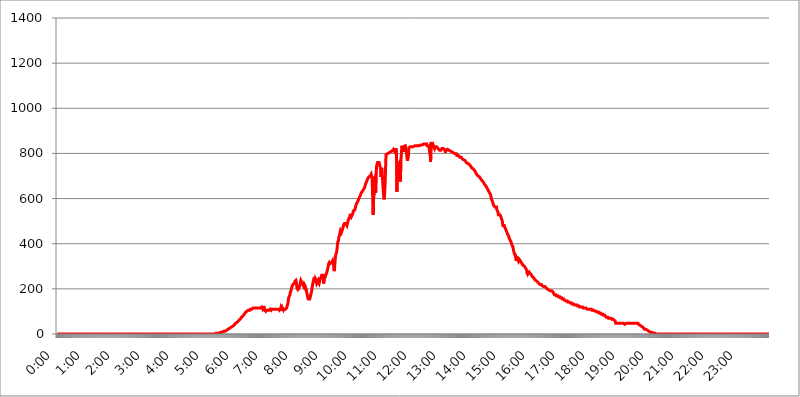
| Category | 2017.08.02. Intenzitás [W/m^2] |
|---|---|
| 0.0 | 0 |
| 0.0006944444444444445 | 0 |
| 0.001388888888888889 | 0 |
| 0.0020833333333333333 | 0 |
| 0.002777777777777778 | 0 |
| 0.003472222222222222 | 0 |
| 0.004166666666666667 | 0 |
| 0.004861111111111111 | 0 |
| 0.005555555555555556 | 0 |
| 0.0062499999999999995 | 0 |
| 0.006944444444444444 | 0 |
| 0.007638888888888889 | 0 |
| 0.008333333333333333 | 0 |
| 0.009027777777777779 | 0 |
| 0.009722222222222222 | 0 |
| 0.010416666666666666 | 0 |
| 0.011111111111111112 | 0 |
| 0.011805555555555555 | 0 |
| 0.012499999999999999 | 0 |
| 0.013194444444444444 | 0 |
| 0.013888888888888888 | 0 |
| 0.014583333333333332 | 0 |
| 0.015277777777777777 | 0 |
| 0.015972222222222224 | 0 |
| 0.016666666666666666 | 0 |
| 0.017361111111111112 | 0 |
| 0.018055555555555557 | 0 |
| 0.01875 | 0 |
| 0.019444444444444445 | 0 |
| 0.02013888888888889 | 0 |
| 0.020833333333333332 | 0 |
| 0.02152777777777778 | 0 |
| 0.022222222222222223 | 0 |
| 0.02291666666666667 | 0 |
| 0.02361111111111111 | 0 |
| 0.024305555555555556 | 0 |
| 0.024999999999999998 | 0 |
| 0.025694444444444447 | 0 |
| 0.02638888888888889 | 0 |
| 0.027083333333333334 | 0 |
| 0.027777777777777776 | 0 |
| 0.02847222222222222 | 0 |
| 0.029166666666666664 | 0 |
| 0.029861111111111113 | 0 |
| 0.030555555555555555 | 0 |
| 0.03125 | 0 |
| 0.03194444444444445 | 0 |
| 0.03263888888888889 | 0 |
| 0.03333333333333333 | 0 |
| 0.034027777777777775 | 0 |
| 0.034722222222222224 | 0 |
| 0.035416666666666666 | 0 |
| 0.036111111111111115 | 0 |
| 0.03680555555555556 | 0 |
| 0.0375 | 0 |
| 0.03819444444444444 | 0 |
| 0.03888888888888889 | 0 |
| 0.03958333333333333 | 0 |
| 0.04027777777777778 | 0 |
| 0.04097222222222222 | 0 |
| 0.041666666666666664 | 0 |
| 0.042361111111111106 | 0 |
| 0.04305555555555556 | 0 |
| 0.043750000000000004 | 0 |
| 0.044444444444444446 | 0 |
| 0.04513888888888889 | 0 |
| 0.04583333333333334 | 0 |
| 0.04652777777777778 | 0 |
| 0.04722222222222222 | 0 |
| 0.04791666666666666 | 0 |
| 0.04861111111111111 | 0 |
| 0.049305555555555554 | 0 |
| 0.049999999999999996 | 0 |
| 0.05069444444444445 | 0 |
| 0.051388888888888894 | 0 |
| 0.052083333333333336 | 0 |
| 0.05277777777777778 | 0 |
| 0.05347222222222222 | 0 |
| 0.05416666666666667 | 0 |
| 0.05486111111111111 | 0 |
| 0.05555555555555555 | 0 |
| 0.05625 | 0 |
| 0.05694444444444444 | 0 |
| 0.057638888888888885 | 0 |
| 0.05833333333333333 | 0 |
| 0.05902777777777778 | 0 |
| 0.059722222222222225 | 0 |
| 0.06041666666666667 | 0 |
| 0.061111111111111116 | 0 |
| 0.06180555555555556 | 0 |
| 0.0625 | 0 |
| 0.06319444444444444 | 0 |
| 0.06388888888888888 | 0 |
| 0.06458333333333334 | 0 |
| 0.06527777777777778 | 0 |
| 0.06597222222222222 | 0 |
| 0.06666666666666667 | 0 |
| 0.06736111111111111 | 0 |
| 0.06805555555555555 | 0 |
| 0.06874999999999999 | 0 |
| 0.06944444444444443 | 0 |
| 0.07013888888888889 | 0 |
| 0.07083333333333333 | 0 |
| 0.07152777777777779 | 0 |
| 0.07222222222222223 | 0 |
| 0.07291666666666667 | 0 |
| 0.07361111111111111 | 0 |
| 0.07430555555555556 | 0 |
| 0.075 | 0 |
| 0.07569444444444444 | 0 |
| 0.0763888888888889 | 0 |
| 0.07708333333333334 | 0 |
| 0.07777777777777778 | 0 |
| 0.07847222222222222 | 0 |
| 0.07916666666666666 | 0 |
| 0.0798611111111111 | 0 |
| 0.08055555555555556 | 0 |
| 0.08125 | 0 |
| 0.08194444444444444 | 0 |
| 0.08263888888888889 | 0 |
| 0.08333333333333333 | 0 |
| 0.08402777777777777 | 0 |
| 0.08472222222222221 | 0 |
| 0.08541666666666665 | 0 |
| 0.08611111111111112 | 0 |
| 0.08680555555555557 | 0 |
| 0.08750000000000001 | 0 |
| 0.08819444444444445 | 0 |
| 0.08888888888888889 | 0 |
| 0.08958333333333333 | 0 |
| 0.09027777777777778 | 0 |
| 0.09097222222222222 | 0 |
| 0.09166666666666667 | 0 |
| 0.09236111111111112 | 0 |
| 0.09305555555555556 | 0 |
| 0.09375 | 0 |
| 0.09444444444444444 | 0 |
| 0.09513888888888888 | 0 |
| 0.09583333333333333 | 0 |
| 0.09652777777777777 | 0 |
| 0.09722222222222222 | 0 |
| 0.09791666666666667 | 0 |
| 0.09861111111111111 | 0 |
| 0.09930555555555555 | 0 |
| 0.09999999999999999 | 0 |
| 0.10069444444444443 | 0 |
| 0.1013888888888889 | 0 |
| 0.10208333333333335 | 0 |
| 0.10277777777777779 | 0 |
| 0.10347222222222223 | 0 |
| 0.10416666666666667 | 0 |
| 0.10486111111111111 | 0 |
| 0.10555555555555556 | 0 |
| 0.10625 | 0 |
| 0.10694444444444444 | 0 |
| 0.1076388888888889 | 0 |
| 0.10833333333333334 | 0 |
| 0.10902777777777778 | 0 |
| 0.10972222222222222 | 0 |
| 0.1111111111111111 | 0 |
| 0.11180555555555556 | 0 |
| 0.11180555555555556 | 0 |
| 0.1125 | 0 |
| 0.11319444444444444 | 0 |
| 0.11388888888888889 | 0 |
| 0.11458333333333333 | 0 |
| 0.11527777777777777 | 0 |
| 0.11597222222222221 | 0 |
| 0.11666666666666665 | 0 |
| 0.1173611111111111 | 0 |
| 0.11805555555555557 | 0 |
| 0.11944444444444445 | 0 |
| 0.12013888888888889 | 0 |
| 0.12083333333333333 | 0 |
| 0.12152777777777778 | 0 |
| 0.12222222222222223 | 0 |
| 0.12291666666666667 | 0 |
| 0.12291666666666667 | 0 |
| 0.12361111111111112 | 0 |
| 0.12430555555555556 | 0 |
| 0.125 | 0 |
| 0.12569444444444444 | 0 |
| 0.12638888888888888 | 0 |
| 0.12708333333333333 | 0 |
| 0.16875 | 0 |
| 0.12847222222222224 | 0 |
| 0.12916666666666668 | 0 |
| 0.12986111111111112 | 0 |
| 0.13055555555555556 | 0 |
| 0.13125 | 0 |
| 0.13194444444444445 | 0 |
| 0.1326388888888889 | 0 |
| 0.13333333333333333 | 0 |
| 0.13402777777777777 | 0 |
| 0.13402777777777777 | 0 |
| 0.13472222222222222 | 0 |
| 0.13541666666666666 | 0 |
| 0.1361111111111111 | 0 |
| 0.13749999999999998 | 0 |
| 0.13819444444444443 | 0 |
| 0.1388888888888889 | 0 |
| 0.13958333333333334 | 0 |
| 0.14027777777777778 | 0 |
| 0.14097222222222222 | 0 |
| 0.14166666666666666 | 0 |
| 0.1423611111111111 | 0 |
| 0.14305555555555557 | 0 |
| 0.14375000000000002 | 0 |
| 0.14444444444444446 | 0 |
| 0.1451388888888889 | 0 |
| 0.1451388888888889 | 0 |
| 0.14652777777777778 | 0 |
| 0.14722222222222223 | 0 |
| 0.14791666666666667 | 0 |
| 0.1486111111111111 | 0 |
| 0.14930555555555555 | 0 |
| 0.15 | 0 |
| 0.15069444444444444 | 0 |
| 0.15138888888888888 | 0 |
| 0.15208333333333332 | 0 |
| 0.15277777777777776 | 0 |
| 0.15347222222222223 | 0 |
| 0.15416666666666667 | 0 |
| 0.15486111111111112 | 0 |
| 0.15555555555555556 | 0 |
| 0.15625 | 0 |
| 0.15694444444444444 | 0 |
| 0.15763888888888888 | 0 |
| 0.15833333333333333 | 0 |
| 0.15902777777777777 | 0 |
| 0.15972222222222224 | 0 |
| 0.16041666666666668 | 0 |
| 0.16111111111111112 | 0 |
| 0.16180555555555556 | 0 |
| 0.1625 | 0 |
| 0.16319444444444445 | 0 |
| 0.1638888888888889 | 0 |
| 0.16458333333333333 | 0 |
| 0.16527777777777777 | 0 |
| 0.16597222222222222 | 0 |
| 0.16666666666666666 | 0 |
| 0.1673611111111111 | 0 |
| 0.16805555555555554 | 0 |
| 0.16874999999999998 | 0 |
| 0.16944444444444443 | 0 |
| 0.17013888888888887 | 0 |
| 0.1708333333333333 | 0 |
| 0.17152777777777775 | 0 |
| 0.17222222222222225 | 0 |
| 0.1729166666666667 | 0 |
| 0.17361111111111113 | 0 |
| 0.17430555555555557 | 0 |
| 0.17500000000000002 | 0 |
| 0.17569444444444446 | 0 |
| 0.1763888888888889 | 0 |
| 0.17708333333333334 | 0 |
| 0.17777777777777778 | 0 |
| 0.17847222222222223 | 0 |
| 0.17916666666666667 | 0 |
| 0.1798611111111111 | 0 |
| 0.18055555555555555 | 0 |
| 0.18125 | 0 |
| 0.18194444444444444 | 0 |
| 0.1826388888888889 | 0 |
| 0.18333333333333335 | 0 |
| 0.1840277777777778 | 0 |
| 0.18472222222222223 | 0 |
| 0.18541666666666667 | 0 |
| 0.18611111111111112 | 0 |
| 0.18680555555555556 | 0 |
| 0.1875 | 0 |
| 0.18819444444444444 | 0 |
| 0.18888888888888888 | 0 |
| 0.18958333333333333 | 0 |
| 0.19027777777777777 | 0 |
| 0.1909722222222222 | 0 |
| 0.19166666666666665 | 0 |
| 0.19236111111111112 | 0 |
| 0.19305555555555554 | 0 |
| 0.19375 | 0 |
| 0.19444444444444445 | 0 |
| 0.1951388888888889 | 0 |
| 0.19583333333333333 | 0 |
| 0.19652777777777777 | 0 |
| 0.19722222222222222 | 0 |
| 0.19791666666666666 | 0 |
| 0.1986111111111111 | 0 |
| 0.19930555555555554 | 0 |
| 0.19999999999999998 | 0 |
| 0.20069444444444443 | 0 |
| 0.20138888888888887 | 0 |
| 0.2020833333333333 | 0 |
| 0.2027777777777778 | 0 |
| 0.2034722222222222 | 0 |
| 0.2041666666666667 | 0 |
| 0.20486111111111113 | 0 |
| 0.20555555555555557 | 0 |
| 0.20625000000000002 | 0 |
| 0.20694444444444446 | 0 |
| 0.2076388888888889 | 0 |
| 0.20833333333333334 | 0 |
| 0.20902777777777778 | 0 |
| 0.20972222222222223 | 0 |
| 0.21041666666666667 | 0 |
| 0.2111111111111111 | 0 |
| 0.21180555555555555 | 0 |
| 0.2125 | 0 |
| 0.21319444444444444 | 0 |
| 0.2138888888888889 | 0 |
| 0.21458333333333335 | 0 |
| 0.2152777777777778 | 0 |
| 0.21597222222222223 | 0 |
| 0.21666666666666667 | 0 |
| 0.21736111111111112 | 0 |
| 0.21805555555555556 | 0 |
| 0.21875 | 0 |
| 0.21944444444444444 | 0 |
| 0.22013888888888888 | 0 |
| 0.22083333333333333 | 0 |
| 0.22152777777777777 | 0 |
| 0.2222222222222222 | 0 |
| 0.22291666666666665 | 3.525 |
| 0.2236111111111111 | 3.525 |
| 0.22430555555555556 | 3.525 |
| 0.225 | 3.525 |
| 0.22569444444444445 | 3.525 |
| 0.2263888888888889 | 3.525 |
| 0.22708333333333333 | 3.525 |
| 0.22777777777777777 | 3.525 |
| 0.22847222222222222 | 3.525 |
| 0.22916666666666666 | 7.887 |
| 0.2298611111111111 | 7.887 |
| 0.23055555555555554 | 7.887 |
| 0.23124999999999998 | 7.887 |
| 0.23194444444444443 | 7.887 |
| 0.23263888888888887 | 12.257 |
| 0.2333333333333333 | 12.257 |
| 0.2340277777777778 | 12.257 |
| 0.2347222222222222 | 12.257 |
| 0.2354166666666667 | 12.257 |
| 0.23611111111111113 | 16.636 |
| 0.23680555555555557 | 16.636 |
| 0.23750000000000002 | 16.636 |
| 0.23819444444444446 | 21.024 |
| 0.2388888888888889 | 21.024 |
| 0.23958333333333334 | 21.024 |
| 0.24027777777777778 | 25.419 |
| 0.24097222222222223 | 25.419 |
| 0.24166666666666667 | 25.419 |
| 0.2423611111111111 | 29.823 |
| 0.24305555555555555 | 29.823 |
| 0.24375 | 29.823 |
| 0.24444444444444446 | 34.234 |
| 0.24513888888888888 | 34.234 |
| 0.24583333333333335 | 34.234 |
| 0.2465277777777778 | 38.653 |
| 0.24722222222222223 | 38.653 |
| 0.24791666666666667 | 38.653 |
| 0.24861111111111112 | 43.079 |
| 0.24930555555555556 | 43.079 |
| 0.25 | 47.511 |
| 0.25069444444444444 | 47.511 |
| 0.2513888888888889 | 47.511 |
| 0.2520833333333333 | 51.951 |
| 0.25277777777777777 | 51.951 |
| 0.2534722222222222 | 56.398 |
| 0.25416666666666665 | 56.398 |
| 0.2548611111111111 | 60.85 |
| 0.2555555555555556 | 60.85 |
| 0.25625000000000003 | 65.31 |
| 0.2569444444444445 | 65.31 |
| 0.2576388888888889 | 69.775 |
| 0.25833333333333336 | 74.246 |
| 0.2590277777777778 | 74.246 |
| 0.25972222222222224 | 78.722 |
| 0.2604166666666667 | 78.722 |
| 0.2611111111111111 | 83.205 |
| 0.26180555555555557 | 83.205 |
| 0.2625 | 87.692 |
| 0.26319444444444445 | 92.184 |
| 0.2638888888888889 | 92.184 |
| 0.26458333333333334 | 96.682 |
| 0.2652777777777778 | 96.682 |
| 0.2659722222222222 | 101.184 |
| 0.26666666666666666 | 101.184 |
| 0.2673611111111111 | 101.184 |
| 0.26805555555555555 | 105.69 |
| 0.26875 | 105.69 |
| 0.26944444444444443 | 105.69 |
| 0.2701388888888889 | 105.69 |
| 0.2708333333333333 | 110.201 |
| 0.27152777777777776 | 110.201 |
| 0.2722222222222222 | 110.201 |
| 0.27291666666666664 | 110.201 |
| 0.2736111111111111 | 110.201 |
| 0.2743055555555555 | 114.716 |
| 0.27499999999999997 | 114.716 |
| 0.27569444444444446 | 114.716 |
| 0.27638888888888885 | 114.716 |
| 0.27708333333333335 | 114.716 |
| 0.2777777777777778 | 114.716 |
| 0.27847222222222223 | 114.716 |
| 0.2791666666666667 | 114.716 |
| 0.2798611111111111 | 114.716 |
| 0.28055555555555556 | 114.716 |
| 0.28125 | 114.716 |
| 0.28194444444444444 | 114.716 |
| 0.2826388888888889 | 114.716 |
| 0.2833333333333333 | 114.716 |
| 0.28402777777777777 | 114.716 |
| 0.2847222222222222 | 114.716 |
| 0.28541666666666665 | 114.716 |
| 0.28611111111111115 | 114.716 |
| 0.28680555555555554 | 119.235 |
| 0.28750000000000003 | 114.716 |
| 0.2881944444444445 | 110.201 |
| 0.2888888888888889 | 114.716 |
| 0.28958333333333336 | 123.758 |
| 0.2902777777777778 | 123.758 |
| 0.29097222222222224 | 105.69 |
| 0.2916666666666667 | 105.69 |
| 0.2923611111111111 | 101.184 |
| 0.29305555555555557 | 105.69 |
| 0.29375 | 105.69 |
| 0.29444444444444445 | 105.69 |
| 0.2951388888888889 | 105.69 |
| 0.29583333333333334 | 105.69 |
| 0.2965277777777778 | 105.69 |
| 0.2972222222222222 | 105.69 |
| 0.29791666666666666 | 105.69 |
| 0.2986111111111111 | 110.201 |
| 0.29930555555555555 | 110.201 |
| 0.3 | 105.69 |
| 0.30069444444444443 | 110.201 |
| 0.3013888888888889 | 110.201 |
| 0.3020833333333333 | 110.201 |
| 0.30277777777777776 | 110.201 |
| 0.3034722222222222 | 110.201 |
| 0.30416666666666664 | 110.201 |
| 0.3048611111111111 | 110.201 |
| 0.3055555555555555 | 110.201 |
| 0.30624999999999997 | 110.201 |
| 0.3069444444444444 | 110.201 |
| 0.3076388888888889 | 110.201 |
| 0.30833333333333335 | 110.201 |
| 0.3090277777777778 | 110.201 |
| 0.30972222222222223 | 110.201 |
| 0.3104166666666667 | 110.201 |
| 0.3111111111111111 | 110.201 |
| 0.31180555555555556 | 105.69 |
| 0.3125 | 105.69 |
| 0.31319444444444444 | 110.201 |
| 0.3138888888888889 | 119.235 |
| 0.3145833333333333 | 114.716 |
| 0.31527777777777777 | 119.235 |
| 0.3159722222222222 | 119.235 |
| 0.31666666666666665 | 110.201 |
| 0.31736111111111115 | 105.69 |
| 0.31805555555555554 | 110.201 |
| 0.31875000000000003 | 110.201 |
| 0.3194444444444445 | 110.201 |
| 0.3201388888888889 | 110.201 |
| 0.32083333333333336 | 110.201 |
| 0.3215277777777778 | 114.716 |
| 0.32222222222222224 | 114.716 |
| 0.3229166666666667 | 128.284 |
| 0.3236111111111111 | 137.347 |
| 0.32430555555555557 | 155.509 |
| 0.325 | 164.605 |
| 0.32569444444444445 | 164.605 |
| 0.3263888888888889 | 173.709 |
| 0.32708333333333334 | 187.378 |
| 0.3277777777777778 | 191.937 |
| 0.3284722222222222 | 201.058 |
| 0.32916666666666666 | 210.182 |
| 0.3298611111111111 | 214.746 |
| 0.33055555555555555 | 219.309 |
| 0.33125 | 219.309 |
| 0.33194444444444443 | 223.873 |
| 0.3326388888888889 | 228.436 |
| 0.3333333333333333 | 233 |
| 0.3340277777777778 | 233 |
| 0.3347222222222222 | 237.564 |
| 0.3354166666666667 | 228.436 |
| 0.3361111111111111 | 205.62 |
| 0.3368055555555556 | 201.058 |
| 0.33749999999999997 | 196.497 |
| 0.33819444444444446 | 196.497 |
| 0.33888888888888885 | 201.058 |
| 0.33958333333333335 | 210.182 |
| 0.34027777777777773 | 214.746 |
| 0.34097222222222223 | 228.436 |
| 0.3416666666666666 | 237.564 |
| 0.3423611111111111 | 233 |
| 0.3430555555555555 | 228.436 |
| 0.34375 | 228.436 |
| 0.3444444444444445 | 223.873 |
| 0.3451388888888889 | 214.746 |
| 0.3458333333333334 | 210.182 |
| 0.34652777777777777 | 219.309 |
| 0.34722222222222227 | 214.746 |
| 0.34791666666666665 | 210.182 |
| 0.34861111111111115 | 201.058 |
| 0.34930555555555554 | 196.497 |
| 0.35000000000000003 | 182.82 |
| 0.3506944444444444 | 173.709 |
| 0.3513888888888889 | 160.056 |
| 0.3520833333333333 | 155.509 |
| 0.3527777777777778 | 155.509 |
| 0.3534722222222222 | 155.509 |
| 0.3541666666666667 | 155.509 |
| 0.3548611111111111 | 164.605 |
| 0.35555555555555557 | 173.709 |
| 0.35625 | 182.82 |
| 0.35694444444444445 | 191.937 |
| 0.3576388888888889 | 210.182 |
| 0.35833333333333334 | 219.309 |
| 0.3590277777777778 | 233 |
| 0.3597222222222222 | 242.127 |
| 0.36041666666666666 | 242.127 |
| 0.3611111111111111 | 237.564 |
| 0.36180555555555555 | 246.689 |
| 0.3625 | 242.127 |
| 0.36319444444444443 | 233 |
| 0.3638888888888889 | 223.873 |
| 0.3645833333333333 | 223.873 |
| 0.3652777777777778 | 233 |
| 0.3659722222222222 | 237.564 |
| 0.3666666666666667 | 228.436 |
| 0.3673611111111111 | 223.873 |
| 0.3680555555555556 | 223.873 |
| 0.36874999999999997 | 242.127 |
| 0.36944444444444446 | 246.689 |
| 0.37013888888888885 | 251.251 |
| 0.37083333333333335 | 260.373 |
| 0.37152777777777773 | 260.373 |
| 0.37222222222222223 | 260.373 |
| 0.3729166666666666 | 260.373 |
| 0.3736111111111111 | 223.873 |
| 0.3743055555555555 | 242.127 |
| 0.375 | 242.127 |
| 0.3756944444444445 | 251.251 |
| 0.3763888888888889 | 260.373 |
| 0.3770833333333334 | 260.373 |
| 0.37777777777777777 | 269.49 |
| 0.37847222222222227 | 269.49 |
| 0.37916666666666665 | 269.49 |
| 0.37986111111111115 | 296.808 |
| 0.38055555555555554 | 310.44 |
| 0.38125000000000003 | 314.98 |
| 0.3819444444444444 | 310.44 |
| 0.3826388888888889 | 310.44 |
| 0.3833333333333333 | 314.98 |
| 0.3840277777777778 | 314.98 |
| 0.3847222222222222 | 314.98 |
| 0.3854166666666667 | 319.517 |
| 0.3861111111111111 | 324.052 |
| 0.38680555555555557 | 310.44 |
| 0.3875 | 305.898 |
| 0.38819444444444445 | 278.603 |
| 0.3888888888888889 | 287.709 |
| 0.38958333333333334 | 319.517 |
| 0.3902777777777778 | 346.682 |
| 0.3909722222222222 | 346.682 |
| 0.39166666666666666 | 360.221 |
| 0.3923611111111111 | 373.729 |
| 0.39305555555555555 | 400.638 |
| 0.39375 | 409.574 |
| 0.39444444444444443 | 414.035 |
| 0.3951388888888889 | 431.833 |
| 0.3958333333333333 | 436.27 |
| 0.3965277777777778 | 449.551 |
| 0.3972222222222222 | 458.38 |
| 0.3979166666666667 | 462.786 |
| 0.3986111111111111 | 449.551 |
| 0.3993055555555556 | 453.968 |
| 0.39999999999999997 | 462.786 |
| 0.40069444444444446 | 471.582 |
| 0.40138888888888885 | 480.356 |
| 0.40208333333333335 | 480.356 |
| 0.40277777777777773 | 489.108 |
| 0.40347222222222223 | 493.475 |
| 0.4041666666666666 | 493.475 |
| 0.4048611111111111 | 489.108 |
| 0.4055555555555555 | 484.735 |
| 0.40625 | 480.356 |
| 0.4069444444444445 | 489.108 |
| 0.4076388888888889 | 497.836 |
| 0.4083333333333334 | 506.542 |
| 0.40902777777777777 | 510.885 |
| 0.40972222222222227 | 510.885 |
| 0.41041666666666665 | 519.555 |
| 0.41111111111111115 | 532.513 |
| 0.41180555555555554 | 528.2 |
| 0.41250000000000003 | 519.555 |
| 0.4131944444444444 | 519.555 |
| 0.4138888888888889 | 523.88 |
| 0.4145833333333333 | 532.513 |
| 0.4152777777777778 | 545.416 |
| 0.4159722222222222 | 545.416 |
| 0.4166666666666667 | 545.416 |
| 0.4173611111111111 | 549.704 |
| 0.41805555555555557 | 558.261 |
| 0.41875 | 562.53 |
| 0.41944444444444445 | 575.299 |
| 0.4201388888888889 | 579.542 |
| 0.42083333333333334 | 583.779 |
| 0.4215277777777778 | 588.009 |
| 0.4222222222222222 | 592.233 |
| 0.42291666666666666 | 596.45 |
| 0.4236111111111111 | 604.864 |
| 0.42430555555555555 | 609.062 |
| 0.425 | 613.252 |
| 0.42569444444444443 | 617.436 |
| 0.4263888888888889 | 625.784 |
| 0.4270833333333333 | 629.948 |
| 0.4277777777777778 | 625.784 |
| 0.4284722222222222 | 634.105 |
| 0.4291666666666667 | 638.256 |
| 0.4298611111111111 | 642.4 |
| 0.4305555555555556 | 646.537 |
| 0.43124999999999997 | 650.667 |
| 0.43194444444444446 | 658.909 |
| 0.43263888888888885 | 667.123 |
| 0.43333333333333335 | 671.22 |
| 0.43402777777777773 | 675.311 |
| 0.43472222222222223 | 683.473 |
| 0.4354166666666666 | 687.544 |
| 0.4361111111111111 | 687.544 |
| 0.4368055555555555 | 695.666 |
| 0.4375 | 695.666 |
| 0.4381944444444445 | 695.666 |
| 0.4388888888888889 | 699.717 |
| 0.4395833333333334 | 699.717 |
| 0.44027777777777777 | 707.8 |
| 0.44097222222222227 | 707.8 |
| 0.44166666666666665 | 687.544 |
| 0.44236111111111115 | 683.473 |
| 0.44305555555555554 | 528.2 |
| 0.44375000000000003 | 604.864 |
| 0.4444444444444444 | 617.436 |
| 0.4451388888888889 | 687.544 |
| 0.4458333333333333 | 699.717 |
| 0.4465277777777778 | 625.784 |
| 0.4472222222222222 | 707.8 |
| 0.4479166666666667 | 743.859 |
| 0.4486111111111111 | 751.803 |
| 0.44930555555555557 | 759.723 |
| 0.45 | 759.723 |
| 0.45069444444444445 | 763.674 |
| 0.4513888888888889 | 759.723 |
| 0.45208333333333334 | 759.723 |
| 0.4527777777777778 | 759.723 |
| 0.4534722222222222 | 731.896 |
| 0.45416666666666666 | 695.666 |
| 0.4548611111111111 | 735.89 |
| 0.45555555555555555 | 727.896 |
| 0.45625 | 723.889 |
| 0.45694444444444443 | 646.537 |
| 0.4576388888888889 | 642.4 |
| 0.4583333333333333 | 596.45 |
| 0.4590277777777778 | 613.252 |
| 0.4597222222222222 | 654.791 |
| 0.4604166666666667 | 727.896 |
| 0.4611111111111111 | 795.074 |
| 0.4618055555555556 | 798.974 |
| 0.46249999999999997 | 798.974 |
| 0.46319444444444446 | 798.974 |
| 0.46388888888888885 | 798.974 |
| 0.46458333333333335 | 798.974 |
| 0.46527777777777773 | 802.868 |
| 0.46597222222222223 | 802.868 |
| 0.4666666666666666 | 802.868 |
| 0.4673611111111111 | 806.757 |
| 0.4680555555555555 | 806.757 |
| 0.46875 | 806.757 |
| 0.4694444444444445 | 810.641 |
| 0.4701388888888889 | 814.519 |
| 0.4708333333333334 | 814.519 |
| 0.47152777777777777 | 818.392 |
| 0.47222222222222227 | 818.392 |
| 0.47291666666666665 | 818.392 |
| 0.47361111111111115 | 806.757 |
| 0.47430555555555554 | 806.757 |
| 0.47500000000000003 | 822.26 |
| 0.4756944444444444 | 806.757 |
| 0.4763888888888889 | 629.948 |
| 0.4770833333333333 | 743.859 |
| 0.4777777777777778 | 739.877 |
| 0.4784722222222222 | 747.834 |
| 0.4791666666666667 | 755.766 |
| 0.4798611111111111 | 739.877 |
| 0.48055555555555557 | 695.666 |
| 0.48125 | 675.311 |
| 0.48194444444444445 | 763.674 |
| 0.4826388888888889 | 798.974 |
| 0.48333333333333334 | 833.834 |
| 0.4840277777777778 | 829.981 |
| 0.4847222222222222 | 818.392 |
| 0.48541666666666666 | 806.757 |
| 0.4861111111111111 | 829.981 |
| 0.48680555555555555 | 833.834 |
| 0.4875 | 833.834 |
| 0.48819444444444443 | 833.834 |
| 0.4888888888888889 | 826.123 |
| 0.4895833333333333 | 806.757 |
| 0.4902777777777778 | 791.169 |
| 0.4909722222222222 | 767.62 |
| 0.4916666666666667 | 775.492 |
| 0.4923611111111111 | 783.342 |
| 0.4930555555555556 | 822.26 |
| 0.49374999999999997 | 822.26 |
| 0.49444444444444446 | 822.26 |
| 0.49513888888888885 | 829.981 |
| 0.49583333333333335 | 829.981 |
| 0.49652777777777773 | 829.981 |
| 0.49722222222222223 | 829.981 |
| 0.4979166666666666 | 833.834 |
| 0.4986111111111111 | 829.981 |
| 0.4993055555555555 | 829.981 |
| 0.5 | 833.834 |
| 0.5006944444444444 | 833.834 |
| 0.5013888888888889 | 833.834 |
| 0.5020833333333333 | 833.834 |
| 0.5027777777777778 | 829.981 |
| 0.5034722222222222 | 833.834 |
| 0.5041666666666667 | 833.834 |
| 0.5048611111111111 | 833.834 |
| 0.5055555555555555 | 833.834 |
| 0.50625 | 833.834 |
| 0.5069444444444444 | 837.682 |
| 0.5076388888888889 | 833.834 |
| 0.5083333333333333 | 833.834 |
| 0.5090277777777777 | 837.682 |
| 0.5097222222222222 | 837.682 |
| 0.5104166666666666 | 837.682 |
| 0.5111111111111112 | 837.682 |
| 0.5118055555555555 | 837.682 |
| 0.5125000000000001 | 837.682 |
| 0.5131944444444444 | 837.682 |
| 0.513888888888889 | 841.526 |
| 0.5145833333333333 | 841.526 |
| 0.5152777777777778 | 841.526 |
| 0.5159722222222222 | 841.526 |
| 0.5166666666666667 | 841.526 |
| 0.517361111111111 | 841.526 |
| 0.5180555555555556 | 841.526 |
| 0.5187499999999999 | 833.834 |
| 0.5194444444444445 | 837.682 |
| 0.5201388888888888 | 829.981 |
| 0.5208333333333334 | 833.834 |
| 0.5215277777777778 | 826.123 |
| 0.5222222222222223 | 802.868 |
| 0.5229166666666667 | 818.392 |
| 0.5236111111111111 | 763.674 |
| 0.5243055555555556 | 845.365 |
| 0.525 | 845.365 |
| 0.5256944444444445 | 841.526 |
| 0.5263888888888889 | 845.365 |
| 0.5270833333333333 | 837.682 |
| 0.5277777777777778 | 841.526 |
| 0.5284722222222222 | 837.682 |
| 0.5291666666666667 | 822.26 |
| 0.5298611111111111 | 829.981 |
| 0.5305555555555556 | 829.981 |
| 0.53125 | 829.981 |
| 0.5319444444444444 | 829.981 |
| 0.5326388888888889 | 829.981 |
| 0.5333333333333333 | 826.123 |
| 0.5340277777777778 | 822.26 |
| 0.5347222222222222 | 822.26 |
| 0.5354166666666667 | 818.392 |
| 0.5361111111111111 | 814.519 |
| 0.5368055555555555 | 818.392 |
| 0.5375 | 814.519 |
| 0.5381944444444444 | 814.519 |
| 0.5388888888888889 | 818.392 |
| 0.5395833333333333 | 822.26 |
| 0.5402777777777777 | 818.392 |
| 0.5409722222222222 | 818.392 |
| 0.5416666666666666 | 822.26 |
| 0.5423611111111112 | 822.26 |
| 0.5430555555555555 | 818.392 |
| 0.5437500000000001 | 814.519 |
| 0.5444444444444444 | 802.868 |
| 0.545138888888889 | 814.519 |
| 0.5458333333333333 | 818.392 |
| 0.5465277777777778 | 814.519 |
| 0.5472222222222222 | 818.392 |
| 0.5479166666666667 | 814.519 |
| 0.548611111111111 | 814.519 |
| 0.5493055555555556 | 814.519 |
| 0.5499999999999999 | 814.519 |
| 0.5506944444444445 | 810.641 |
| 0.5513888888888888 | 810.641 |
| 0.5520833333333334 | 810.641 |
| 0.5527777777777778 | 806.757 |
| 0.5534722222222223 | 806.757 |
| 0.5541666666666667 | 806.757 |
| 0.5548611111111111 | 802.868 |
| 0.5555555555555556 | 802.868 |
| 0.55625 | 798.974 |
| 0.5569444444444445 | 802.868 |
| 0.5576388888888889 | 798.974 |
| 0.5583333333333333 | 798.974 |
| 0.5590277777777778 | 798.974 |
| 0.5597222222222222 | 798.974 |
| 0.5604166666666667 | 791.169 |
| 0.5611111111111111 | 791.169 |
| 0.5618055555555556 | 791.169 |
| 0.5625 | 791.169 |
| 0.5631944444444444 | 787.258 |
| 0.5638888888888889 | 787.258 |
| 0.5645833333333333 | 783.342 |
| 0.5652777777777778 | 783.342 |
| 0.5659722222222222 | 783.342 |
| 0.5666666666666667 | 783.342 |
| 0.5673611111111111 | 779.42 |
| 0.5680555555555555 | 775.492 |
| 0.56875 | 775.492 |
| 0.5694444444444444 | 771.559 |
| 0.5701388888888889 | 771.559 |
| 0.5708333333333333 | 767.62 |
| 0.5715277777777777 | 767.62 |
| 0.5722222222222222 | 767.62 |
| 0.5729166666666666 | 763.674 |
| 0.5736111111111112 | 759.723 |
| 0.5743055555555555 | 763.674 |
| 0.5750000000000001 | 759.723 |
| 0.5756944444444444 | 755.766 |
| 0.576388888888889 | 751.803 |
| 0.5770833333333333 | 751.803 |
| 0.5777777777777778 | 751.803 |
| 0.5784722222222222 | 747.834 |
| 0.5791666666666667 | 747.834 |
| 0.579861111111111 | 743.859 |
| 0.5805555555555556 | 739.877 |
| 0.5812499999999999 | 735.89 |
| 0.5819444444444445 | 735.89 |
| 0.5826388888888888 | 735.89 |
| 0.5833333333333334 | 731.896 |
| 0.5840277777777778 | 727.896 |
| 0.5847222222222223 | 727.896 |
| 0.5854166666666667 | 723.889 |
| 0.5861111111111111 | 719.877 |
| 0.5868055555555556 | 715.858 |
| 0.5875 | 715.858 |
| 0.5881944444444445 | 707.8 |
| 0.5888888888888889 | 707.8 |
| 0.5895833333333333 | 703.762 |
| 0.5902777777777778 | 699.717 |
| 0.5909722222222222 | 699.717 |
| 0.5916666666666667 | 695.666 |
| 0.5923611111111111 | 695.666 |
| 0.5930555555555556 | 691.608 |
| 0.59375 | 687.544 |
| 0.5944444444444444 | 683.473 |
| 0.5951388888888889 | 683.473 |
| 0.5958333333333333 | 679.395 |
| 0.5965277777777778 | 679.395 |
| 0.5972222222222222 | 675.311 |
| 0.5979166666666667 | 671.22 |
| 0.5986111111111111 | 667.123 |
| 0.5993055555555555 | 663.019 |
| 0.6 | 658.909 |
| 0.6006944444444444 | 658.909 |
| 0.6013888888888889 | 654.791 |
| 0.6020833333333333 | 650.667 |
| 0.6027777777777777 | 646.537 |
| 0.6034722222222222 | 642.4 |
| 0.6041666666666666 | 638.256 |
| 0.6048611111111112 | 638.256 |
| 0.6055555555555555 | 634.105 |
| 0.6062500000000001 | 625.784 |
| 0.6069444444444444 | 625.784 |
| 0.607638888888889 | 617.436 |
| 0.6083333333333333 | 609.062 |
| 0.6090277777777778 | 596.45 |
| 0.6097222222222222 | 592.233 |
| 0.6104166666666667 | 588.009 |
| 0.611111111111111 | 579.542 |
| 0.6118055555555556 | 571.049 |
| 0.6124999999999999 | 571.049 |
| 0.6131944444444445 | 566.793 |
| 0.6138888888888888 | 562.53 |
| 0.6145833333333334 | 562.53 |
| 0.6152777777777778 | 562.53 |
| 0.6159722222222223 | 562.53 |
| 0.6166666666666667 | 549.704 |
| 0.6173611111111111 | 549.704 |
| 0.6180555555555556 | 541.121 |
| 0.61875 | 528.2 |
| 0.6194444444444445 | 532.513 |
| 0.6201388888888889 | 532.513 |
| 0.6208333333333333 | 528.2 |
| 0.6215277777777778 | 523.88 |
| 0.6222222222222222 | 519.555 |
| 0.6229166666666667 | 515.223 |
| 0.6236111111111111 | 506.542 |
| 0.6243055555555556 | 497.836 |
| 0.625 | 480.356 |
| 0.6256944444444444 | 480.356 |
| 0.6263888888888889 | 480.356 |
| 0.6270833333333333 | 480.356 |
| 0.6277777777777778 | 471.582 |
| 0.6284722222222222 | 467.187 |
| 0.6291666666666667 | 462.786 |
| 0.6298611111111111 | 462.786 |
| 0.6305555555555555 | 458.38 |
| 0.63125 | 445.129 |
| 0.6319444444444444 | 440.702 |
| 0.6326388888888889 | 436.27 |
| 0.6333333333333333 | 431.833 |
| 0.6340277777777777 | 422.943 |
| 0.6347222222222222 | 422.943 |
| 0.6354166666666666 | 414.035 |
| 0.6361111111111112 | 409.574 |
| 0.6368055555555555 | 405.108 |
| 0.6375000000000001 | 396.164 |
| 0.6381944444444444 | 391.685 |
| 0.638888888888889 | 387.202 |
| 0.6395833333333333 | 378.224 |
| 0.6402777777777778 | 364.728 |
| 0.6409722222222222 | 364.728 |
| 0.6416666666666667 | 351.198 |
| 0.642361111111111 | 346.682 |
| 0.6430555555555556 | 337.639 |
| 0.6437499999999999 | 324.052 |
| 0.6444444444444445 | 337.639 |
| 0.6451388888888888 | 337.639 |
| 0.6458333333333334 | 328.584 |
| 0.6465277777777778 | 324.052 |
| 0.6472222222222223 | 333.113 |
| 0.6479166666666667 | 333.113 |
| 0.6486111111111111 | 328.584 |
| 0.6493055555555556 | 324.052 |
| 0.65 | 319.517 |
| 0.6506944444444445 | 319.517 |
| 0.6513888888888889 | 314.98 |
| 0.6520833333333333 | 310.44 |
| 0.6527777777777778 | 305.898 |
| 0.6534722222222222 | 305.898 |
| 0.6541666666666667 | 305.898 |
| 0.6548611111111111 | 301.354 |
| 0.6555555555555556 | 296.808 |
| 0.65625 | 296.808 |
| 0.6569444444444444 | 292.259 |
| 0.6576388888888889 | 287.709 |
| 0.6583333333333333 | 283.156 |
| 0.6590277777777778 | 269.49 |
| 0.6597222222222222 | 264.932 |
| 0.6604166666666667 | 269.49 |
| 0.6611111111111111 | 269.49 |
| 0.6618055555555555 | 274.047 |
| 0.6625 | 269.49 |
| 0.6631944444444444 | 269.49 |
| 0.6638888888888889 | 269.49 |
| 0.6645833333333333 | 264.932 |
| 0.6652777777777777 | 260.373 |
| 0.6659722222222222 | 255.813 |
| 0.6666666666666666 | 255.813 |
| 0.6673611111111111 | 251.251 |
| 0.6680555555555556 | 251.251 |
| 0.6687500000000001 | 246.689 |
| 0.6694444444444444 | 242.127 |
| 0.6701388888888888 | 242.127 |
| 0.6708333333333334 | 237.564 |
| 0.6715277777777778 | 237.564 |
| 0.6722222222222222 | 237.564 |
| 0.6729166666666666 | 233 |
| 0.6736111111111112 | 233 |
| 0.6743055555555556 | 228.436 |
| 0.6749999999999999 | 228.436 |
| 0.6756944444444444 | 223.873 |
| 0.6763888888888889 | 223.873 |
| 0.6770833333333334 | 219.309 |
| 0.6777777777777777 | 219.309 |
| 0.6784722222222223 | 219.309 |
| 0.6791666666666667 | 219.309 |
| 0.6798611111111111 | 214.746 |
| 0.6805555555555555 | 214.746 |
| 0.68125 | 214.746 |
| 0.6819444444444445 | 210.182 |
| 0.6826388888888889 | 210.182 |
| 0.6833333333333332 | 210.182 |
| 0.6840277777777778 | 210.182 |
| 0.6847222222222222 | 210.182 |
| 0.6854166666666667 | 205.62 |
| 0.686111111111111 | 205.62 |
| 0.6868055555555556 | 201.058 |
| 0.6875 | 201.058 |
| 0.6881944444444444 | 201.058 |
| 0.688888888888889 | 196.497 |
| 0.6895833333333333 | 196.497 |
| 0.6902777777777778 | 196.497 |
| 0.6909722222222222 | 191.937 |
| 0.6916666666666668 | 191.937 |
| 0.6923611111111111 | 191.937 |
| 0.6930555555555555 | 191.937 |
| 0.69375 | 191.937 |
| 0.6944444444444445 | 191.937 |
| 0.6951388888888889 | 187.378 |
| 0.6958333333333333 | 182.82 |
| 0.6965277777777777 | 178.264 |
| 0.6972222222222223 | 173.709 |
| 0.6979166666666666 | 173.709 |
| 0.6986111111111111 | 173.709 |
| 0.6993055555555556 | 173.709 |
| 0.7000000000000001 | 169.156 |
| 0.7006944444444444 | 169.156 |
| 0.7013888888888888 | 169.156 |
| 0.7020833333333334 | 169.156 |
| 0.7027777777777778 | 164.605 |
| 0.7034722222222222 | 164.605 |
| 0.7041666666666666 | 164.605 |
| 0.7048611111111112 | 164.605 |
| 0.7055555555555556 | 160.056 |
| 0.7062499999999999 | 160.056 |
| 0.7069444444444444 | 160.056 |
| 0.7076388888888889 | 160.056 |
| 0.7083333333333334 | 155.509 |
| 0.7090277777777777 | 155.509 |
| 0.7097222222222223 | 155.509 |
| 0.7104166666666667 | 155.509 |
| 0.7111111111111111 | 150.964 |
| 0.7118055555555555 | 150.964 |
| 0.7125 | 150.964 |
| 0.7131944444444445 | 146.423 |
| 0.7138888888888889 | 146.423 |
| 0.7145833333333332 | 146.423 |
| 0.7152777777777778 | 146.423 |
| 0.7159722222222222 | 141.884 |
| 0.7166666666666667 | 141.884 |
| 0.717361111111111 | 141.884 |
| 0.7180555555555556 | 141.884 |
| 0.71875 | 141.884 |
| 0.7194444444444444 | 137.347 |
| 0.720138888888889 | 137.347 |
| 0.7208333333333333 | 137.347 |
| 0.7215277777777778 | 137.347 |
| 0.7222222222222222 | 132.814 |
| 0.7229166666666668 | 132.814 |
| 0.7236111111111111 | 132.814 |
| 0.7243055555555555 | 132.814 |
| 0.725 | 128.284 |
| 0.7256944444444445 | 128.284 |
| 0.7263888888888889 | 128.284 |
| 0.7270833333333333 | 128.284 |
| 0.7277777777777777 | 128.284 |
| 0.7284722222222223 | 128.284 |
| 0.7291666666666666 | 128.284 |
| 0.7298611111111111 | 123.758 |
| 0.7305555555555556 | 123.758 |
| 0.7312500000000001 | 123.758 |
| 0.7319444444444444 | 123.758 |
| 0.7326388888888888 | 119.235 |
| 0.7333333333333334 | 119.235 |
| 0.7340277777777778 | 119.235 |
| 0.7347222222222222 | 119.235 |
| 0.7354166666666666 | 119.235 |
| 0.7361111111111112 | 119.235 |
| 0.7368055555555556 | 119.235 |
| 0.7374999999999999 | 114.716 |
| 0.7381944444444444 | 114.716 |
| 0.7388888888888889 | 114.716 |
| 0.7395833333333334 | 114.716 |
| 0.7402777777777777 | 114.716 |
| 0.7409722222222223 | 114.716 |
| 0.7416666666666667 | 114.716 |
| 0.7423611111111111 | 114.716 |
| 0.7430555555555555 | 110.201 |
| 0.74375 | 110.201 |
| 0.7444444444444445 | 110.201 |
| 0.7451388888888889 | 110.201 |
| 0.7458333333333332 | 110.201 |
| 0.7465277777777778 | 110.201 |
| 0.7472222222222222 | 110.201 |
| 0.7479166666666667 | 110.201 |
| 0.748611111111111 | 110.201 |
| 0.7493055555555556 | 110.201 |
| 0.75 | 105.69 |
| 0.7506944444444444 | 105.69 |
| 0.751388888888889 | 105.69 |
| 0.7520833333333333 | 105.69 |
| 0.7527777777777778 | 105.69 |
| 0.7534722222222222 | 105.69 |
| 0.7541666666666668 | 101.184 |
| 0.7548611111111111 | 101.184 |
| 0.7555555555555555 | 101.184 |
| 0.75625 | 101.184 |
| 0.7569444444444445 | 101.184 |
| 0.7576388888888889 | 96.682 |
| 0.7583333333333333 | 96.682 |
| 0.7590277777777777 | 96.682 |
| 0.7597222222222223 | 96.682 |
| 0.7604166666666666 | 92.184 |
| 0.7611111111111111 | 92.184 |
| 0.7618055555555556 | 92.184 |
| 0.7625000000000001 | 92.184 |
| 0.7631944444444444 | 87.692 |
| 0.7638888888888888 | 87.692 |
| 0.7645833333333334 | 87.692 |
| 0.7652777777777778 | 87.692 |
| 0.7659722222222222 | 83.205 |
| 0.7666666666666666 | 83.205 |
| 0.7673611111111112 | 83.205 |
| 0.7680555555555556 | 83.205 |
| 0.7687499999999999 | 78.722 |
| 0.7694444444444444 | 78.722 |
| 0.7701388888888889 | 74.246 |
| 0.7708333333333334 | 74.246 |
| 0.7715277777777777 | 74.246 |
| 0.7722222222222223 | 74.246 |
| 0.7729166666666667 | 69.775 |
| 0.7736111111111111 | 69.775 |
| 0.7743055555555555 | 69.775 |
| 0.775 | 69.775 |
| 0.7756944444444445 | 69.775 |
| 0.7763888888888889 | 69.775 |
| 0.7770833333333332 | 69.775 |
| 0.7777777777777778 | 65.31 |
| 0.7784722222222222 | 65.31 |
| 0.7791666666666667 | 65.31 |
| 0.779861111111111 | 65.31 |
| 0.7805555555555556 | 65.31 |
| 0.78125 | 60.85 |
| 0.7819444444444444 | 60.85 |
| 0.782638888888889 | 56.398 |
| 0.7833333333333333 | 47.511 |
| 0.7840277777777778 | 47.511 |
| 0.7847222222222222 | 47.511 |
| 0.7854166666666668 | 47.511 |
| 0.7861111111111111 | 47.511 |
| 0.7868055555555555 | 47.511 |
| 0.7875 | 47.511 |
| 0.7881944444444445 | 47.511 |
| 0.7888888888888889 | 47.511 |
| 0.7895833333333333 | 47.511 |
| 0.7902777777777777 | 47.511 |
| 0.7909722222222223 | 47.511 |
| 0.7916666666666666 | 47.511 |
| 0.7923611111111111 | 47.511 |
| 0.7930555555555556 | 47.511 |
| 0.7937500000000001 | 47.511 |
| 0.7944444444444444 | 47.511 |
| 0.7951388888888888 | 47.511 |
| 0.7958333333333334 | 43.079 |
| 0.7965277777777778 | 43.079 |
| 0.7972222222222222 | 43.079 |
| 0.7979166666666666 | 47.511 |
| 0.7986111111111112 | 47.511 |
| 0.7993055555555556 | 47.511 |
| 0.7999999999999999 | 47.511 |
| 0.8006944444444444 | 47.511 |
| 0.8013888888888889 | 47.511 |
| 0.8020833333333334 | 47.511 |
| 0.8027777777777777 | 47.511 |
| 0.8034722222222223 | 47.511 |
| 0.8041666666666667 | 47.511 |
| 0.8048611111111111 | 47.511 |
| 0.8055555555555555 | 47.511 |
| 0.80625 | 47.511 |
| 0.8069444444444445 | 47.511 |
| 0.8076388888888889 | 47.511 |
| 0.8083333333333332 | 47.511 |
| 0.8090277777777778 | 47.511 |
| 0.8097222222222222 | 47.511 |
| 0.8104166666666667 | 47.511 |
| 0.811111111111111 | 47.511 |
| 0.8118055555555556 | 47.511 |
| 0.8125 | 47.511 |
| 0.8131944444444444 | 47.511 |
| 0.813888888888889 | 47.511 |
| 0.8145833333333333 | 47.511 |
| 0.8152777777777778 | 43.079 |
| 0.8159722222222222 | 43.079 |
| 0.8166666666666668 | 38.653 |
| 0.8173611111111111 | 38.653 |
| 0.8180555555555555 | 38.653 |
| 0.81875 | 38.653 |
| 0.8194444444444445 | 34.234 |
| 0.8201388888888889 | 34.234 |
| 0.8208333333333333 | 29.823 |
| 0.8215277777777777 | 29.823 |
| 0.8222222222222223 | 25.419 |
| 0.8229166666666666 | 25.419 |
| 0.8236111111111111 | 21.024 |
| 0.8243055555555556 | 21.024 |
| 0.8250000000000001 | 21.024 |
| 0.8256944444444444 | 21.024 |
| 0.8263888888888888 | 16.636 |
| 0.8270833333333334 | 16.636 |
| 0.8277777777777778 | 16.636 |
| 0.8284722222222222 | 12.257 |
| 0.8291666666666666 | 12.257 |
| 0.8298611111111112 | 12.257 |
| 0.8305555555555556 | 12.257 |
| 0.8312499999999999 | 12.257 |
| 0.8319444444444444 | 7.887 |
| 0.8326388888888889 | 7.887 |
| 0.8333333333333334 | 7.887 |
| 0.8340277777777777 | 7.887 |
| 0.8347222222222223 | 7.887 |
| 0.8354166666666667 | 3.525 |
| 0.8361111111111111 | 3.525 |
| 0.8368055555555555 | 3.525 |
| 0.8375 | 3.525 |
| 0.8381944444444445 | 3.525 |
| 0.8388888888888889 | 3.525 |
| 0.8395833333333332 | 0 |
| 0.8402777777777778 | 0 |
| 0.8409722222222222 | 0 |
| 0.8416666666666667 | 0 |
| 0.842361111111111 | 0 |
| 0.8430555555555556 | 0 |
| 0.84375 | 0 |
| 0.8444444444444444 | 0 |
| 0.845138888888889 | 0 |
| 0.8458333333333333 | 0 |
| 0.8465277777777778 | 0 |
| 0.8472222222222222 | 0 |
| 0.8479166666666668 | 0 |
| 0.8486111111111111 | 0 |
| 0.8493055555555555 | 0 |
| 0.85 | 0 |
| 0.8506944444444445 | 0 |
| 0.8513888888888889 | 0 |
| 0.8520833333333333 | 0 |
| 0.8527777777777777 | 0 |
| 0.8534722222222223 | 0 |
| 0.8541666666666666 | 0 |
| 0.8548611111111111 | 0 |
| 0.8555555555555556 | 0 |
| 0.8562500000000001 | 0 |
| 0.8569444444444444 | 0 |
| 0.8576388888888888 | 0 |
| 0.8583333333333334 | 0 |
| 0.8590277777777778 | 0 |
| 0.8597222222222222 | 0 |
| 0.8604166666666666 | 0 |
| 0.8611111111111112 | 0 |
| 0.8618055555555556 | 0 |
| 0.8624999999999999 | 0 |
| 0.8631944444444444 | 0 |
| 0.8638888888888889 | 0 |
| 0.8645833333333334 | 0 |
| 0.8652777777777777 | 0 |
| 0.8659722222222223 | 0 |
| 0.8666666666666667 | 0 |
| 0.8673611111111111 | 0 |
| 0.8680555555555555 | 0 |
| 0.86875 | 0 |
| 0.8694444444444445 | 0 |
| 0.8701388888888889 | 0 |
| 0.8708333333333332 | 0 |
| 0.8715277777777778 | 0 |
| 0.8722222222222222 | 0 |
| 0.8729166666666667 | 0 |
| 0.873611111111111 | 0 |
| 0.8743055555555556 | 0 |
| 0.875 | 0 |
| 0.8756944444444444 | 0 |
| 0.876388888888889 | 0 |
| 0.8770833333333333 | 0 |
| 0.8777777777777778 | 0 |
| 0.8784722222222222 | 0 |
| 0.8791666666666668 | 0 |
| 0.8798611111111111 | 0 |
| 0.8805555555555555 | 0 |
| 0.88125 | 0 |
| 0.8819444444444445 | 0 |
| 0.8826388888888889 | 0 |
| 0.8833333333333333 | 0 |
| 0.8840277777777777 | 0 |
| 0.8847222222222223 | 0 |
| 0.8854166666666666 | 0 |
| 0.8861111111111111 | 0 |
| 0.8868055555555556 | 0 |
| 0.8875000000000001 | 0 |
| 0.8881944444444444 | 0 |
| 0.8888888888888888 | 0 |
| 0.8895833333333334 | 0 |
| 0.8902777777777778 | 0 |
| 0.8909722222222222 | 0 |
| 0.8916666666666666 | 0 |
| 0.8923611111111112 | 0 |
| 0.8930555555555556 | 0 |
| 0.8937499999999999 | 0 |
| 0.8944444444444444 | 0 |
| 0.8951388888888889 | 0 |
| 0.8958333333333334 | 0 |
| 0.8965277777777777 | 0 |
| 0.8972222222222223 | 0 |
| 0.8979166666666667 | 0 |
| 0.8986111111111111 | 0 |
| 0.8993055555555555 | 0 |
| 0.9 | 0 |
| 0.9006944444444445 | 0 |
| 0.9013888888888889 | 0 |
| 0.9020833333333332 | 0 |
| 0.9027777777777778 | 0 |
| 0.9034722222222222 | 0 |
| 0.9041666666666667 | 0 |
| 0.904861111111111 | 0 |
| 0.9055555555555556 | 0 |
| 0.90625 | 0 |
| 0.9069444444444444 | 0 |
| 0.907638888888889 | 0 |
| 0.9083333333333333 | 0 |
| 0.9090277777777778 | 0 |
| 0.9097222222222222 | 0 |
| 0.9104166666666668 | 0 |
| 0.9111111111111111 | 0 |
| 0.9118055555555555 | 0 |
| 0.9125 | 0 |
| 0.9131944444444445 | 0 |
| 0.9138888888888889 | 0 |
| 0.9145833333333333 | 0 |
| 0.9152777777777777 | 0 |
| 0.9159722222222223 | 0 |
| 0.9166666666666666 | 0 |
| 0.9173611111111111 | 0 |
| 0.9180555555555556 | 0 |
| 0.9187500000000001 | 0 |
| 0.9194444444444444 | 0 |
| 0.9201388888888888 | 0 |
| 0.9208333333333334 | 0 |
| 0.9215277777777778 | 0 |
| 0.9222222222222222 | 0 |
| 0.9229166666666666 | 0 |
| 0.9236111111111112 | 0 |
| 0.9243055555555556 | 0 |
| 0.9249999999999999 | 0 |
| 0.9256944444444444 | 0 |
| 0.9263888888888889 | 0 |
| 0.9270833333333334 | 0 |
| 0.9277777777777777 | 0 |
| 0.9284722222222223 | 0 |
| 0.9291666666666667 | 0 |
| 0.9298611111111111 | 0 |
| 0.9305555555555555 | 0 |
| 0.93125 | 0 |
| 0.9319444444444445 | 0 |
| 0.9326388888888889 | 0 |
| 0.9333333333333332 | 0 |
| 0.9340277777777778 | 0 |
| 0.9347222222222222 | 0 |
| 0.9354166666666667 | 0 |
| 0.936111111111111 | 0 |
| 0.9368055555555556 | 0 |
| 0.9375 | 0 |
| 0.9381944444444444 | 0 |
| 0.938888888888889 | 0 |
| 0.9395833333333333 | 0 |
| 0.9402777777777778 | 0 |
| 0.9409722222222222 | 0 |
| 0.9416666666666668 | 0 |
| 0.9423611111111111 | 0 |
| 0.9430555555555555 | 0 |
| 0.94375 | 0 |
| 0.9444444444444445 | 0 |
| 0.9451388888888889 | 0 |
| 0.9458333333333333 | 0 |
| 0.9465277777777777 | 0 |
| 0.9472222222222223 | 0 |
| 0.9479166666666666 | 0 |
| 0.9486111111111111 | 0 |
| 0.9493055555555556 | 0 |
| 0.9500000000000001 | 0 |
| 0.9506944444444444 | 0 |
| 0.9513888888888888 | 0 |
| 0.9520833333333334 | 0 |
| 0.9527777777777778 | 0 |
| 0.9534722222222222 | 0 |
| 0.9541666666666666 | 0 |
| 0.9548611111111112 | 0 |
| 0.9555555555555556 | 0 |
| 0.9562499999999999 | 0 |
| 0.9569444444444444 | 0 |
| 0.9576388888888889 | 0 |
| 0.9583333333333334 | 0 |
| 0.9590277777777777 | 0 |
| 0.9597222222222223 | 0 |
| 0.9604166666666667 | 0 |
| 0.9611111111111111 | 0 |
| 0.9618055555555555 | 0 |
| 0.9625 | 0 |
| 0.9631944444444445 | 0 |
| 0.9638888888888889 | 0 |
| 0.9645833333333332 | 0 |
| 0.9652777777777778 | 0 |
| 0.9659722222222222 | 0 |
| 0.9666666666666667 | 0 |
| 0.967361111111111 | 0 |
| 0.9680555555555556 | 0 |
| 0.96875 | 0 |
| 0.9694444444444444 | 0 |
| 0.970138888888889 | 0 |
| 0.9708333333333333 | 0 |
| 0.9715277777777778 | 0 |
| 0.9722222222222222 | 0 |
| 0.9729166666666668 | 0 |
| 0.9736111111111111 | 0 |
| 0.9743055555555555 | 0 |
| 0.975 | 0 |
| 0.9756944444444445 | 0 |
| 0.9763888888888889 | 0 |
| 0.9770833333333333 | 0 |
| 0.9777777777777777 | 0 |
| 0.9784722222222223 | 0 |
| 0.9791666666666666 | 0 |
| 0.9798611111111111 | 0 |
| 0.9805555555555556 | 0 |
| 0.9812500000000001 | 0 |
| 0.9819444444444444 | 0 |
| 0.9826388888888888 | 0 |
| 0.9833333333333334 | 0 |
| 0.9840277777777778 | 0 |
| 0.9847222222222222 | 0 |
| 0.9854166666666666 | 0 |
| 0.9861111111111112 | 0 |
| 0.9868055555555556 | 0 |
| 0.9874999999999999 | 0 |
| 0.9881944444444444 | 0 |
| 0.9888888888888889 | 0 |
| 0.9895833333333334 | 0 |
| 0.9902777777777777 | 0 |
| 0.9909722222222223 | 0 |
| 0.9916666666666667 | 0 |
| 0.9923611111111111 | 0 |
| 0.9930555555555555 | 0 |
| 0.99375 | 0 |
| 0.9944444444444445 | 0 |
| 0.9951388888888889 | 0 |
| 0.9958333333333332 | 0 |
| 0.9965277777777778 | 0 |
| 0.9972222222222222 | 0 |
| 0.9979166666666667 | 0 |
| 0.998611111111111 | 0 |
| 0.9993055555555556 | 0 |